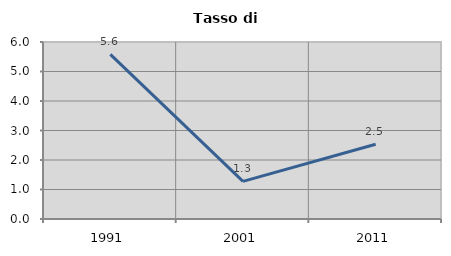
| Category | Tasso di disoccupazione   |
|---|---|
| 1991.0 | 5.578 |
| 2001.0 | 1.277 |
| 2011.0 | 2.536 |